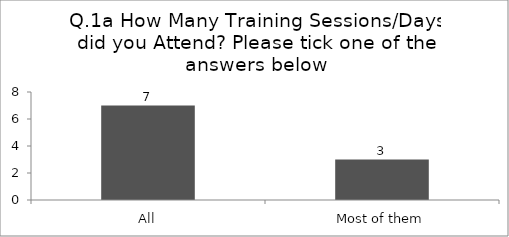
| Category | Q.1a How Many Training Sessions/Days did you Attend? Please tick one of the answers below |
|---|---|
| All | 7 |
| Most of them | 3 |